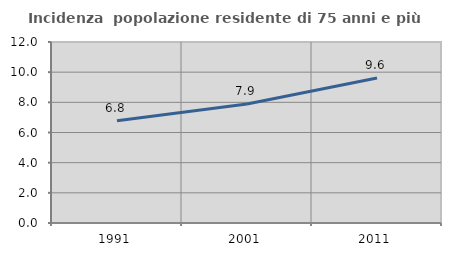
| Category | Incidenza  popolazione residente di 75 anni e più |
|---|---|
| 1991.0 | 6.776 |
| 2001.0 | 7.89 |
| 2011.0 | 9.616 |